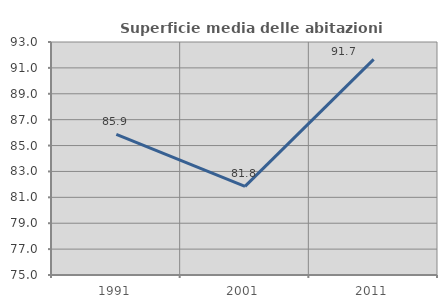
| Category | Superficie media delle abitazioni occupate |
|---|---|
| 1991.0 | 85.867 |
| 2001.0 | 81.848 |
| 2011.0 | 91.657 |